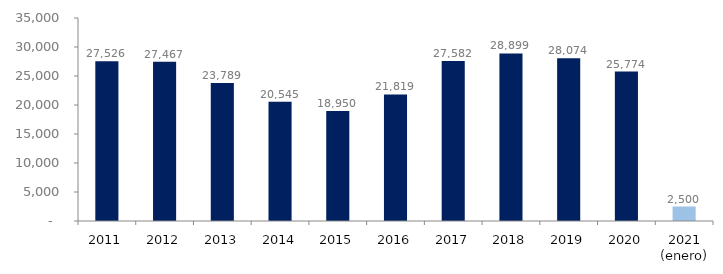
| Category | Series 1 |
|---|---|
| 2011 | 27525.675 |
| 2012 | 27466.673 |
| 2013 | 23789.445 |
| 2014 | 20545.414 |
| 2015 | 18950.14 |
| 2016 | 21819.079 |
| 2017 | 27581.607 |
| 2018 | 28898.658 |
| 2019 | 28073.793 |
| 2020 | 25773.552 |
| 2021 (enero) | 2499.671 |